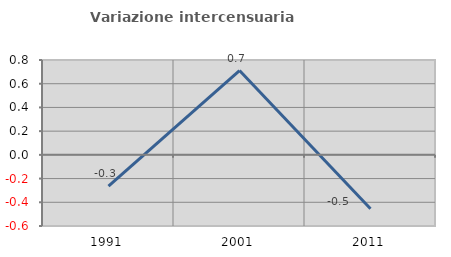
| Category | Variazione intercensuaria annua |
|---|---|
| 1991.0 | -0.264 |
| 2001.0 | 0.711 |
| 2011.0 | -0.454 |